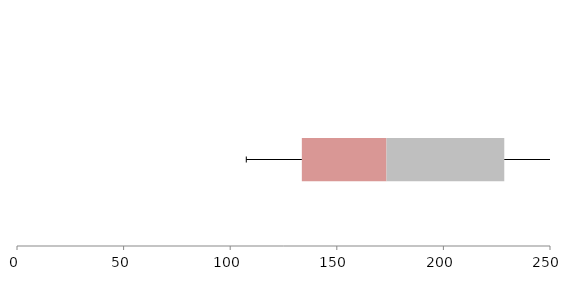
| Category | Series 1 | Series 2 | Series 3 |
|---|---|---|---|
| 0 | 133.6 | 39.713 | 55.245 |